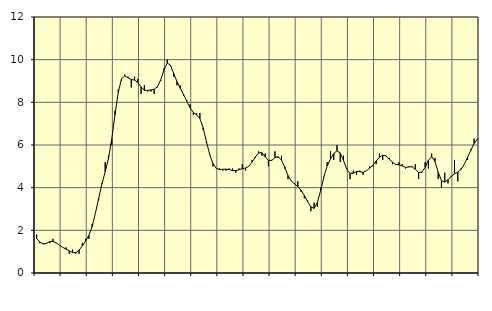
| Category | Piggar | Series 1 |
|---|---|---|
| nan | 1.8 | 1.62 |
| 87.0 | 1.4 | 1.45 |
| 87.0 | 1.4 | 1.36 |
| 87.0 | 1.4 | 1.39 |
| nan | 1.4 | 1.47 |
| 88.0 | 1.6 | 1.48 |
| 88.0 | 1.4 | 1.41 |
| 88.0 | 1.3 | 1.3 |
| nan | 1.2 | 1.2 |
| 89.0 | 1.2 | 1.12 |
| 89.0 | 0.9 | 1.04 |
| 89.0 | 1.1 | 0.96 |
| nan | 0.9 | 0.95 |
| 90.0 | 0.9 | 1.07 |
| 90.0 | 1.4 | 1.27 |
| 90.0 | 1.6 | 1.49 |
| nan | 1.6 | 1.76 |
| 91.0 | 2.3 | 2.17 |
| 91.0 | 2.8 | 2.8 |
| 91.0 | 3.4 | 3.5 |
| nan | 4.2 | 4.17 |
| 92.0 | 5.2 | 4.75 |
| 92.0 | 5.5 | 5.36 |
| 92.0 | 6 | 6.27 |
| nan | 7.6 | 7.42 |
| 93.0 | 8.6 | 8.47 |
| 93.0 | 9 | 9.1 |
| 93.0 | 9.3 | 9.24 |
| nan | 9.2 | 9.15 |
| 94.0 | 8.7 | 9.07 |
| 94.0 | 9.2 | 9.04 |
| 94.0 | 9.1 | 8.93 |
| nan | 8.4 | 8.72 |
| 95.0 | 8.8 | 8.57 |
| 95.0 | 8.5 | 8.56 |
| 95.0 | 8.5 | 8.58 |
| nan | 8.4 | 8.61 |
| 96.0 | 8.7 | 8.73 |
| 96.0 | 9 | 9.05 |
| 96.0 | 9.6 | 9.52 |
| nan | 10 | 9.84 |
| 97.0 | 9.7 | 9.74 |
| 97.0 | 9.2 | 9.35 |
| 97.0 | 8.8 | 8.97 |
| nan | 8.8 | 8.66 |
| 98.0 | 8.3 | 8.37 |
| 98.0 | 8.1 | 8.05 |
| 98.0 | 7.9 | 7.74 |
| nan | 7.4 | 7.53 |
| 99.0 | 7.5 | 7.41 |
| 99.0 | 7.5 | 7.24 |
| 99.0 | 6.7 | 6.81 |
| nan | 6.1 | 6.17 |
| 0.0 | 5.6 | 5.56 |
| 0.0 | 5 | 5.13 |
| 0.0 | 4.9 | 4.91 |
| nan | 4.9 | 4.85 |
| 1.0 | 4.8 | 4.86 |
| 1.0 | 4.8 | 4.87 |
| 1.0 | 4.9 | 4.85 |
| nan | 4.9 | 4.8 |
| 2.0 | 4.7 | 4.8 |
| 2.0 | 4.9 | 4.84 |
| 2.0 | 5.1 | 4.89 |
| nan | 4.8 | 4.92 |
| 3.0 | 5 | 5 |
| 3.0 | 5.3 | 5.2 |
| 3.0 | 5.4 | 5.44 |
| nan | 5.7 | 5.63 |
| 4.0 | 5.5 | 5.64 |
| 4.0 | 5.6 | 5.45 |
| 4.0 | 5 | 5.28 |
| nan | 5.3 | 5.28 |
| 5.0 | 5.7 | 5.41 |
| 5.0 | 5.4 | 5.45 |
| 5.0 | 5.5 | 5.29 |
| nan | 4.9 | 4.96 |
| 6.0 | 4.4 | 4.57 |
| 6.0 | 4.3 | 4.31 |
| 6.0 | 4.2 | 4.18 |
| nan | 4.3 | 4.05 |
| 7.0 | 3.8 | 3.88 |
| 7.0 | 3.5 | 3.64 |
| 7.0 | 3.4 | 3.35 |
| nan | 2.9 | 3.1 |
| 8.0 | 3.3 | 3.03 |
| 8.0 | 3.1 | 3.31 |
| 8.0 | 4 | 3.87 |
| nan | 4.5 | 4.51 |
| 9.0 | 5.2 | 5.02 |
| 9.0 | 5.7 | 5.34 |
| 9.0 | 5.3 | 5.6 |
| nan | 6 | 5.73 |
| 10.0 | 5.2 | 5.63 |
| 10.0 | 5.5 | 5.28 |
| 10.0 | 4.9 | 4.87 |
| nan | 4.4 | 4.67 |
| 11.0 | 4.8 | 4.67 |
| 11.0 | 4.6 | 4.76 |
| 11.0 | 4.8 | 4.75 |
| nan | 4.6 | 4.72 |
| 12.0 | 4.8 | 4.79 |
| 12.0 | 5 | 4.91 |
| 12.0 | 5 | 5.06 |
| nan | 5.1 | 5.25 |
| 13.0 | 5.6 | 5.42 |
| 13.0 | 5.3 | 5.52 |
| 13.0 | 5.5 | 5.49 |
| nan | 5.4 | 5.34 |
| 14.0 | 5.1 | 5.19 |
| 14.0 | 5.1 | 5.09 |
| 14.0 | 5.2 | 5.07 |
| nan | 5.1 | 5.02 |
| 15.0 | 4.9 | 4.95 |
| 15.0 | 5 | 4.97 |
| 15.0 | 5 | 4.98 |
| nan | 5.1 | 4.86 |
| 16.0 | 4.4 | 4.71 |
| 16.0 | 4.7 | 4.73 |
| 16.0 | 5.2 | 4.95 |
| nan | 4.9 | 5.28 |
| 17.0 | 5.6 | 5.45 |
| 17.0 | 5.4 | 5.23 |
| 17.0 | 4.4 | 4.72 |
| nan | 4 | 4.33 |
| 18.0 | 4.7 | 4.26 |
| 18.0 | 4.2 | 4.37 |
| 18.0 | 4.5 | 4.53 |
| nan | 5.3 | 4.65 |
| 19.0 | 4.3 | 4.73 |
| 19.0 | 4.9 | 4.85 |
| 19.0 | 5.1 | 5.1 |
| nan | 5.3 | 5.42 |
| 20.0 | 5.8 | 5.75 |
| 20.0 | 6.3 | 6.07 |
| 20.0 | 6.3 | 6.27 |